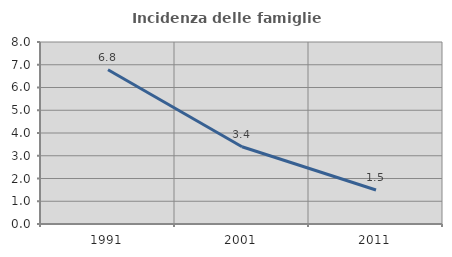
| Category | Incidenza delle famiglie numerose |
|---|---|
| 1991.0 | 6.782 |
| 2001.0 | 3.396 |
| 2011.0 | 1.494 |